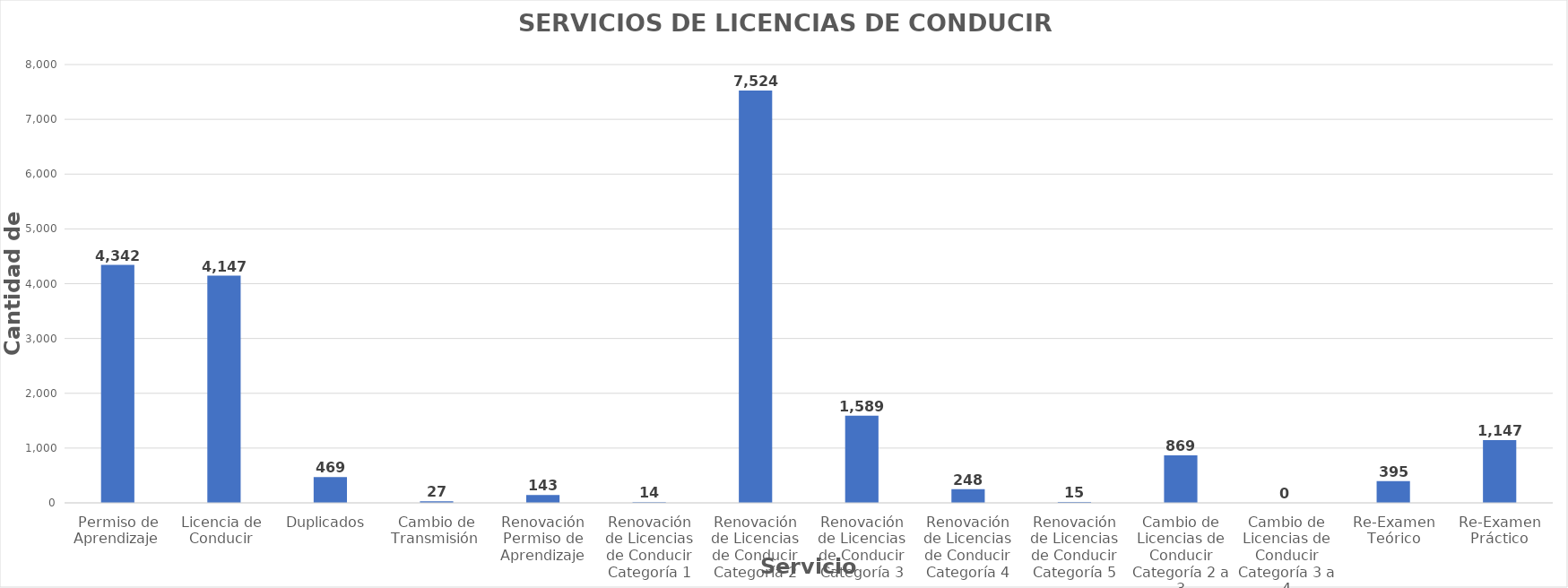
| Category | Series 0 |
|---|---|
| Permiso de Aprendizaje  | 4342 |
| Licencia de  Conducir  | 4147 |
| Duplicados  | 469 |
| Cambio de Transmisión  | 27 |
| Renovación Permiso de Aprendizaje | 143 |
| Renovación de Licencias de Conducir Categoría 1 | 14 |
| Renovación de Licencias de Conducir Categoría 2 | 7524 |
| Renovación de Licencias de Conducir Categoría 3 | 1589 |
| Renovación de Licencias de Conducir Categoría 4 | 248 |
| Renovación de Licencias de Conducir Categoría 5 | 15 |
| Cambio de Licencias de Conducir Categoría 2 a 3 | 869 |
| Cambio de Licencias de Conducir Categoría 3 a 4 | 0 |
| Re-Examen Teórico | 395 |
| Re-Examen Práctico | 1147 |